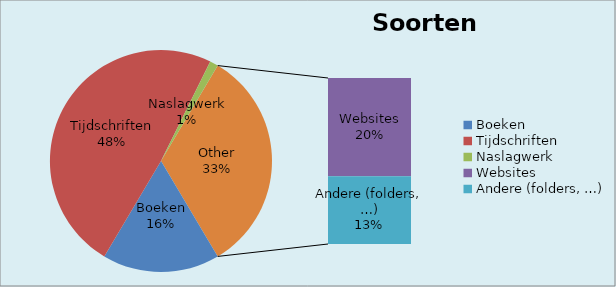
| Category | Series 0 | Reeks 2+Blad2!$A$3 |
|---|---|---|
| Boeken | 14 |  |
| Tijdschriften | 40 |  |
| Naslagwerk | 1 |  |
| Websites | 16 |  |
| Andere (folders, …) | 11 |  |